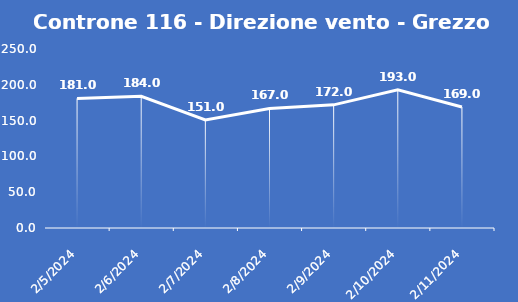
| Category | Controne 116 - Direzione vento - Grezzo (°N) |
|---|---|
| 2/5/24 | 181 |
| 2/6/24 | 184 |
| 2/7/24 | 151 |
| 2/8/24 | 167 |
| 2/9/24 | 172 |
| 2/10/24 | 193 |
| 2/11/24 | 169 |